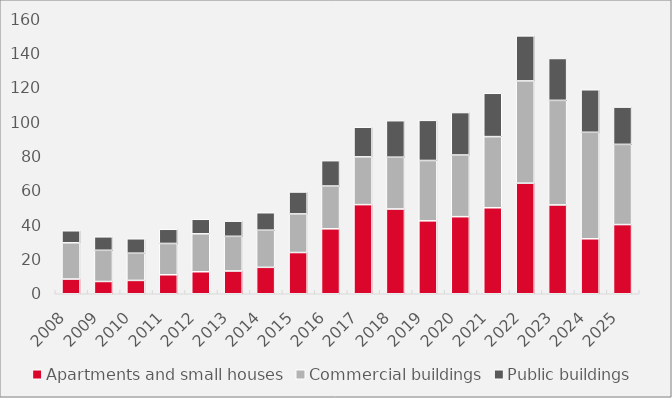
| Category | Apartments and small houses | Commercial buildings | Public buildings |
|---|---|---|---|
| 2008.0 | 8.563 | 21.079 | 7.008 |
| 2009.0 | 7.138 | 18.149 | 7.85 |
| 2010.0 | 7.761 | 15.839 | 8.387 |
| 2011.0 | 11.052 | 18.211 | 8.237 |
| 2012.0 | 12.809 | 22.07 | 8.442 |
| 2013.0 | 13.25 | 20.163 | 8.823 |
| 2014.0 | 15.367 | 21.62 | 10.153 |
| 2015.0 | 23.985 | 22.475 | 12.745 |
| 2016.0 | 37.79 | 24.888 | 14.75 |
| 2017.0 | 51.858 | 27.79 | 17.238 |
| 2018.0 | 49.327 | 30.125 | 21.237 |
| 2019.0 | 42.43 | 35.111 | 23.343 |
| 2020.0 | 44.844 | 35.891 | 24.69 |
| 2021.0 | 50.034 | 41.391 | 25.204 |
| 2022.0 | 64.341 | 59.502 | 26.187 |
| 2023.0 | 51.694 | 60.826 | 24.362 |
| 2024.0 | 31.99 | 61.952 | 24.742 |
| 2025.0 | 40.246 | 46.669 | 21.691 |